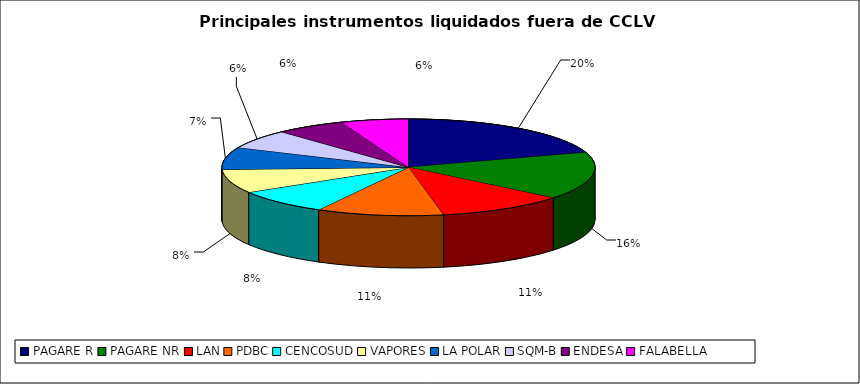
| Category | Series 0 |
|---|---|
| PAGARE R | 1688 |
| PAGARE NR | 1336 |
| LAN | 938 |
| PDBC | 927 |
| CENCOSUD | 705 |
| VAPORES | 671 |
| LA POLAR | 627 |
| SQM-B | 536 |
| ENDESA | 508 |
| FALABELLA | 494 |